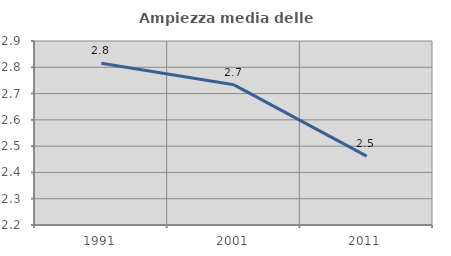
| Category | Ampiezza media delle famiglie |
|---|---|
| 1991.0 | 2.815 |
| 2001.0 | 2.733 |
| 2011.0 | 2.462 |